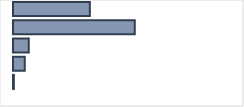
| Category | Series 0 |
|---|---|
| 0 | 33.855 |
| 1 | 53.645 |
| 2 | 6.982 |
| 3 | 5.143 |
| 4 | 0.375 |